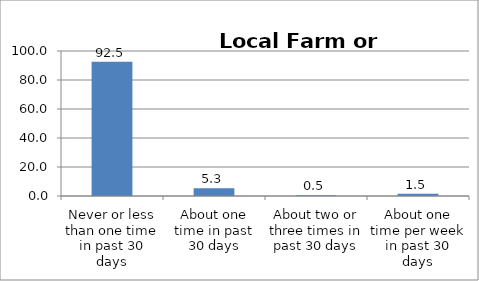
| Category | Series 0 |
|---|---|
| Never or less than one time in past 30 days | 92.513 |
| About one time in past 30 days | 5.272 |
| About two or three times in past 30 days | 0.531 |
| About one time per week in past 30 days | 1.492 |